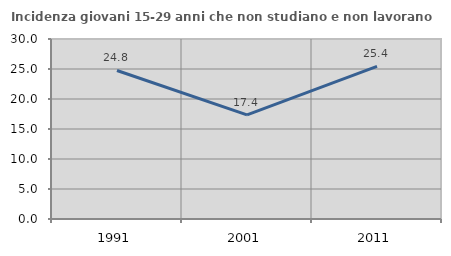
| Category | Incidenza giovani 15-29 anni che non studiano e non lavorano  |
|---|---|
| 1991.0 | 24.754 |
| 2001.0 | 17.361 |
| 2011.0 | 25.439 |